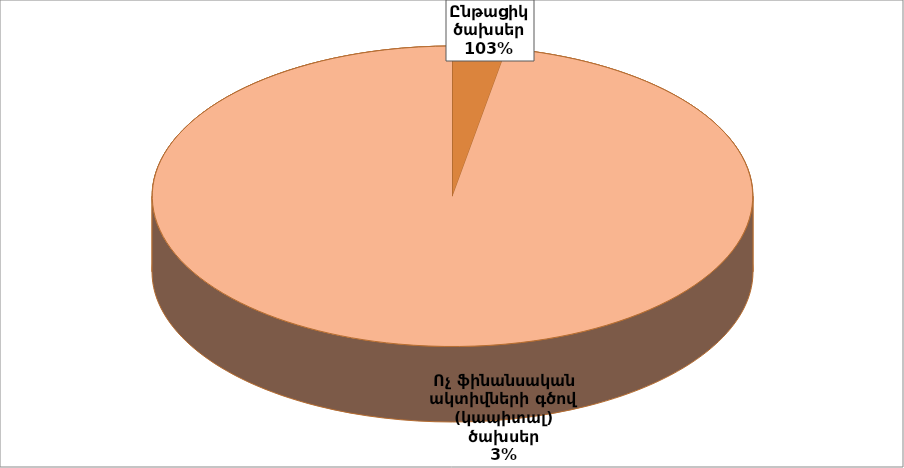
| Category | 481845.6 | -13511.1 |
|---|---|---|
| Ընթացիկ ծախսեր | 481845.6 |  |
| Ոչ ֆինանսական ակտիվների գծով (կապիտալ) ծախսեր | -13511.1 |  |